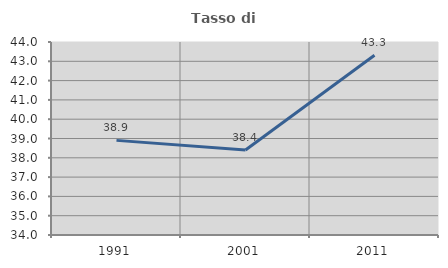
| Category | Tasso di occupazione   |
|---|---|
| 1991.0 | 38.903 |
| 2001.0 | 38.406 |
| 2011.0 | 43.313 |